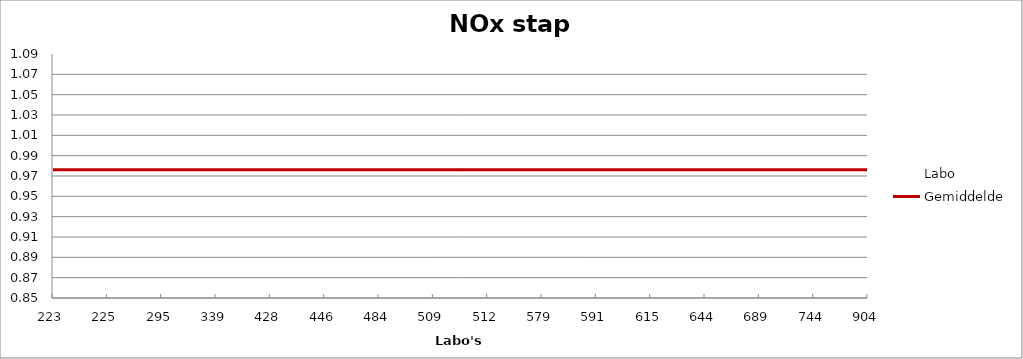
| Category | Labo | Gemiddelde |
|---|---|---|
| 223.0 | 1.039 | 0.976 |
| 225.0 | 0.959 | 0.976 |
| 295.0 | 1.06 | 0.976 |
| 339.0 | 0.874 | 0.976 |
| 428.0 | 1.018 | 0.976 |
| 446.0 | 0.956 | 0.976 |
| 484.0 | 0.956 | 0.976 |
| 509.0 | 0.978 | 0.976 |
| 512.0 | 0.965 | 0.976 |
| 579.0 | 0.973 | 0.976 |
| 591.0 | 0.994 | 0.976 |
| 615.0 | 0.929 | 0.976 |
| 644.0 | 1.039 | 0.976 |
| 689.0 | 0.931 | 0.976 |
| 744.0 | 0.989 | 0.976 |
| 904.0 | 0.937 | 0.976 |